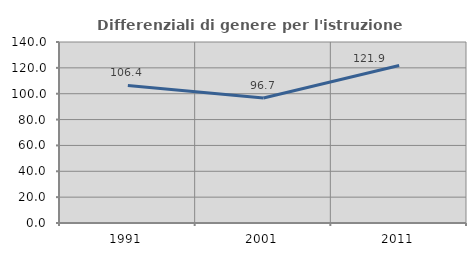
| Category | Differenziali di genere per l'istruzione superiore |
|---|---|
| 1991.0 | 106.377 |
| 2001.0 | 96.656 |
| 2011.0 | 121.874 |